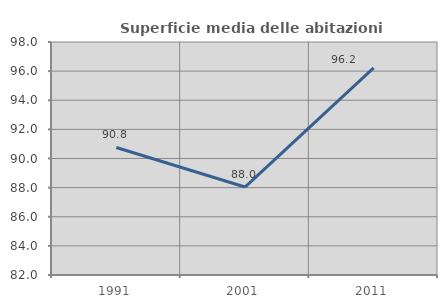
| Category | Superficie media delle abitazioni occupate |
|---|---|
| 1991.0 | 90.757 |
| 2001.0 | 88.039 |
| 2011.0 | 96.217 |